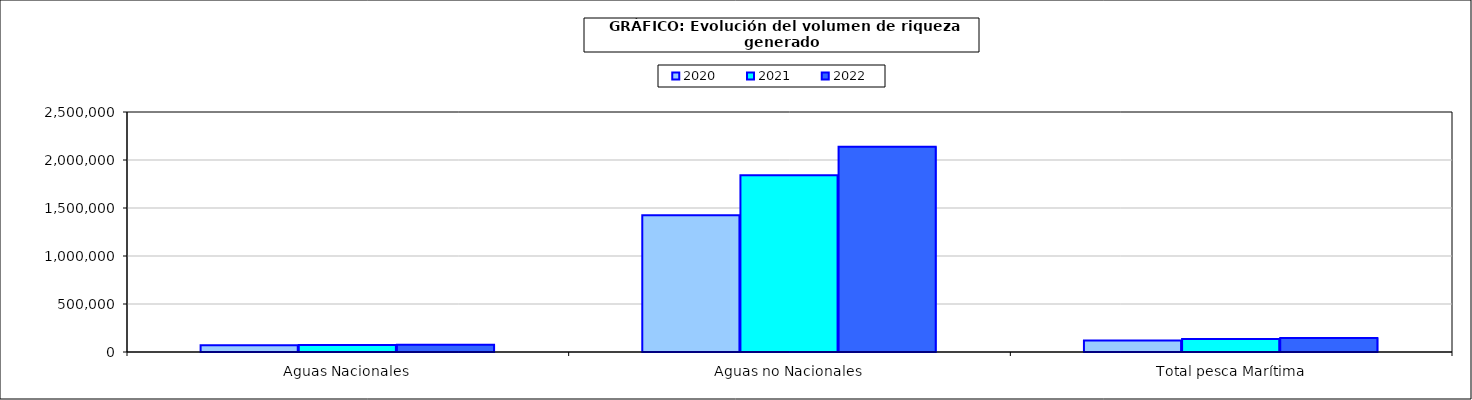
| Category | 2020 | 2021 | 2022 |
|---|---|---|---|
| 0 | 70812.188 | 73529.552 | 76687.92 |
| 1 | 1423788.088 | 1840952.991 | 2137191.18 |
| 2 | 118667.24 | 135183.858 | 146126.557 |